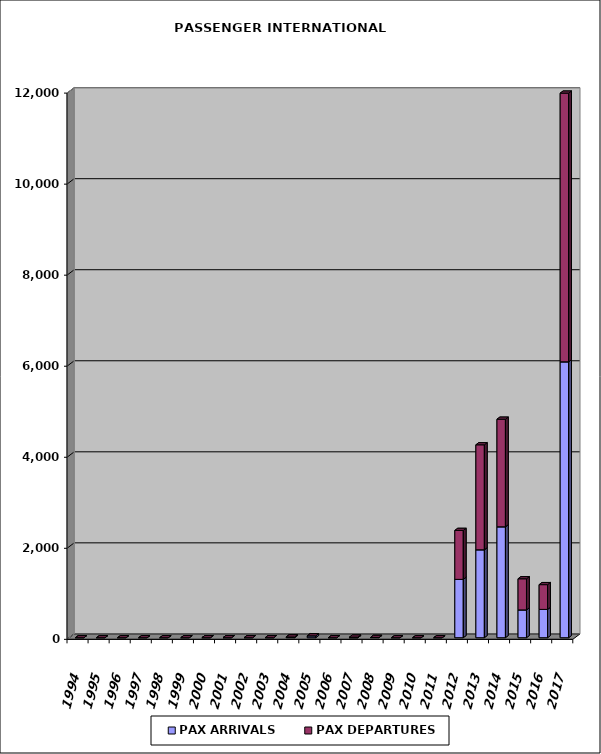
| Category | PAX ARRIVALS | PAX DEPARTURES |
|---|---|---|
| 1994.0 | 0 | 0 |
| 1995.0 | 0 | 0 |
| 1996.0 | 0 | 0 |
| 1997.0 | 0 | 0 |
| 1998.0 | 0 | 0 |
| 1999.0 | 0 | 0 |
| 2000.0 | 0 | 0 |
| 2001.0 | 0 | 0 |
| 2002.0 | 0 | 0 |
| 2003.0 | 0 | 0 |
| 2004.0 | 17 | 0 |
| 2005.0 | 41 | 0 |
| 2006.0 | 0 | 0 |
| 2007.0 | 0 | 14 |
| 2008.0 | 5 | 0 |
| 2009.0 | 0 | 0 |
| 2010.0 | 0 | 0 |
| 2011.0 | 0 | 0 |
| 2012.0 | 1282 | 1075 |
| 2013.0 | 1932 | 2306 |
| 2014.0 | 2437 | 2363 |
| 2015.0 | 611 | 684 |
| 2016.0 | 622 | 544 |
| 2017.0 | 6061 | 5902 |